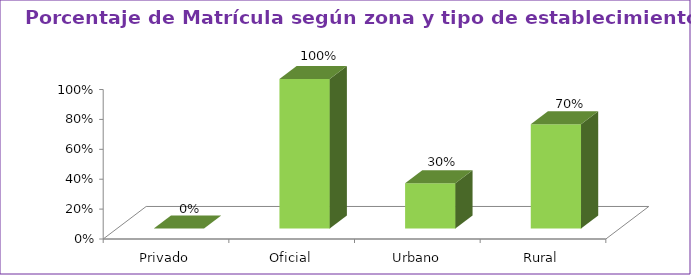
| Category | Series 1 |
|---|---|
| Privado | 0 |
| Oficial | 1 |
| Urbano | 0.303 |
| Rural | 0.697 |